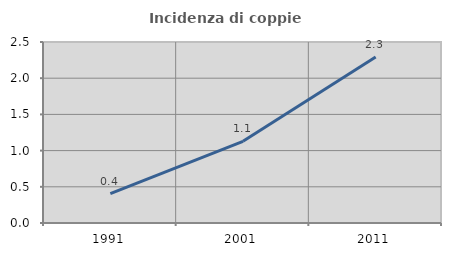
| Category | Incidenza di coppie miste |
|---|---|
| 1991.0 | 0.405 |
| 2001.0 | 1.128 |
| 2011.0 | 2.293 |